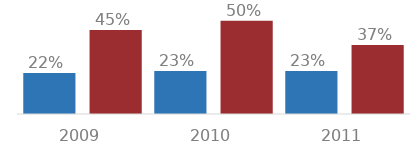
| Category | Series 1 | Series 2 |
|---|---|---|
| 2009.0 | 0.22 | 0.45 |
| 2010.0 | 0.23 | 0.5 |
| 2011.0 | 0.23 | 0.37 |